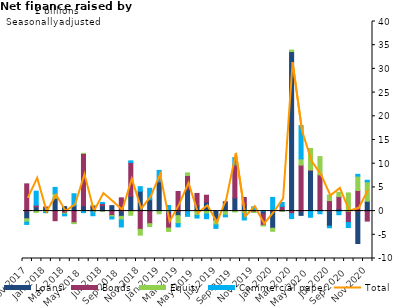
| Category | Loans | Bonds | Equity | Commercial paper |
|---|---|---|---|---|
| Nov-2017 | -1.609 | 5.749 | -0.706 | -0.5 |
| Dec-2017 | 0.87 | 0.379 | -0.277 | 2.954 |
| Jan-2018 | 0.767 | 0.093 | -0.23 | -0.116 |
| Feb-2018 | 2.71 | -2.027 | 0.982 | 1.309 |
| Mar-2018 | 0.958 | -0.433 | -0.213 | -0.357 |
| Apr-2018 | 1.127 | -2.435 | -0.213 | 2.532 |
| May-2018 | 1.116 | 11.031 | 0.038 | -0.33 |
| Jun-2018 | 0.851 | 0.294 | 0.086 | -0.977 |
| Jul-2018 | 1.107 | 0.494 | -0.012 | 0.233 |
| Aug-2018 | 1.152 | -0.932 | -0.304 | -0.431 |
| Sep-2018 | -1.109 | 2.795 | -0.757 | -1.484 |
| Oct-2018 | 3.102 | 7.138 | -0.874 | 0.363 |
| Nov-2018 | 4.196 | -3.846 | -1.226 | 0.958 |
| Dec-2018 | 2.406 | -2.65 | -0.61 | 2.407 |
| Jan-2019 | 6.112 | 0.161 | -0.575 | 2.312 |
| Feb-2019 | -0.495 | -3.084 | -0.708 | 1.181 |
| Mar-2019 | -0.96 | 4.131 | -1.687 | -0.683 |
| Apr-2019 | 4.593 | 2.92 | 0.546 | -1.109 |
| May-2019 | 1.104 | 2.622 | -0.908 | -0.561 |
| Jun-2019 | 1.919 | 1.437 | -0.6 | -1.001 |
| Jul-2019 | -1.716 | -0.281 | -0.911 | -0.742 |
| Aug-2019 | 1.811 | 0.174 | -0.857 | -0.357 |
| Sep-2019 | 2.756 | 6.981 | -0.179 | 1.548 |
| Oct-2019 | 1.221 | 1.651 | -0.451 | -1.416 |
| Nov-2019 | 0.24 | -0.195 | -0.099 | 0.654 |
| Dec-2019 | -0.588 | -2.415 | -0.152 | 0.031 |
| Jan-2020 | -3.61 | 0.155 | -0.65 | 2.731 |
| Feb-2020 | 0.228 | 0.764 | -0.04 | 0.826 |
| Mar-2020 | 33.661 | -0.54 | 0.305 | -1.041 |
| Apr-2020 | -0.905 | 9.698 | 1.321 | 7.014 |
| May-2020 | 8.554 | 0.131 | 4.516 | -1.303 |
| Jun-2020 | 0.158 | 7.494 | 3.844 | -0.564 |
| Jul-2020 | -3.175 | 2.212 | 1.183 | -0.34 |
| Aug-2020 | 0.448 | 2.614 | 0.91 | -0.762 |
| Sep-2020 | -0.289 | -2.122 | 3.838 | -1.058 |
| Oct-2020 | -6.835 | 4.349 | 3.039 | 0.366 |
| Nov-2020 | 2.072 | -2.106 | 4.111 | 0.327 |